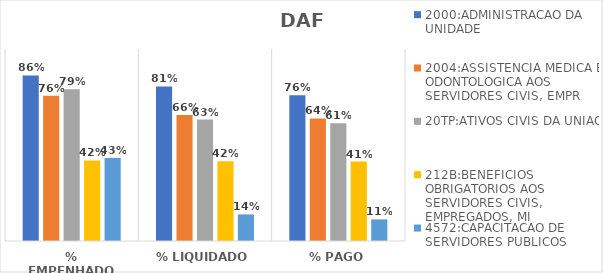
| Category | 2000:ADMINISTRACAO DA UNIDADE | 2004:ASSISTENCIA MEDICA E ODONTOLOGICA AOS SERVIDORES CIVIS, EMPR | 20TP:ATIVOS CIVIS DA UNIAO | 212B:BENEFICIOS OBRIGATORIOS AOS SERVIDORES CIVIS, EMPREGADOS, MI | 4572:CAPACITACAO DE SERVIDORES PUBLICOS FEDERAIS EM PROCESSO DE Q |
|---|---|---|---|---|---|
| % EMPENHADO | 0.862 | 0.757 | 0.791 | 0.42 | 0.432 |
| % LIQUIDADO | 0.805 | 0.657 | 0.632 | 0.415 | 0.138 |
| % PAGO | 0.759 | 0.638 | 0.614 | 0.414 | 0.112 |